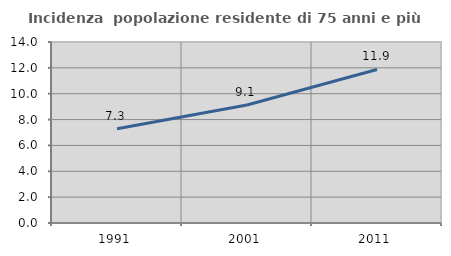
| Category | Incidenza  popolazione residente di 75 anni e più |
|---|---|
| 1991.0 | 7.282 |
| 2001.0 | 9.122 |
| 2011.0 | 11.878 |